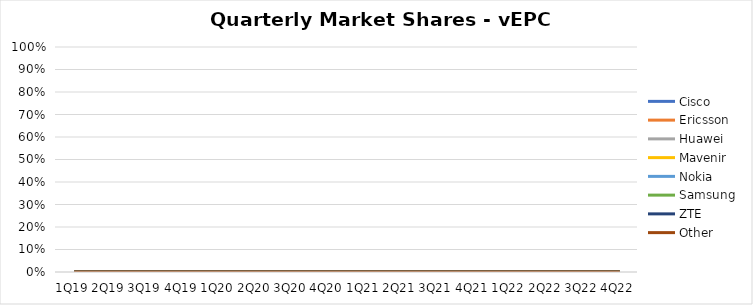
| Category | Cisco | Ericsson | Huawei | Mavenir | Nokia | Samsung | ZTE | Other |
|---|---|---|---|---|---|---|---|---|
| 1Q19 | 0 | 0 | 0 | 0 | 0 | 0 | 0 | 0 |
| 2Q19 | 0 | 0 | 0 | 0 | 0 | 0 | 0 | 0 |
| 3Q19 | 0 | 0 | 0 | 0 | 0 | 0 | 0 | 0 |
| 4Q19 | 0 | 0 | 0 | 0 | 0 | 0 | 0 | 0 |
| 1Q20 | 0 | 0 | 0 | 0 | 0 | 0 | 0 | 0 |
| 2Q20 | 0 | 0 | 0 | 0 | 0 | 0 | 0 | 0 |
| 3Q20 | 0 | 0 | 0 | 0 | 0 | 0 | 0 | 0 |
| 4Q20 | 0 | 0 | 0 | 0 | 0 | 0 | 0 | 0 |
| 1Q21 | 0 | 0 | 0 | 0 | 0 | 0 | 0 | 0 |
| 2Q21 | 0 | 0 | 0 | 0 | 0 | 0 | 0 | 0 |
| 3Q21 | 0 | 0 | 0 | 0 | 0 | 0 | 0 | 0 |
| 4Q21 | 0 | 0 | 0 | 0 | 0 | 0 | 0 | 0 |
| 1Q22 | 0 | 0 | 0 | 0 | 0 | 0 | 0 | 0 |
| 2Q22 | 0 | 0 | 0 | 0 | 0 | 0 | 0 | 0 |
| 3Q22 | 0 | 0 | 0 | 0 | 0 | 0 | 0 | 0 |
| 4Q22 | 0 | 0 | 0 | 0 | 0 | 0 | 0 | 0 |